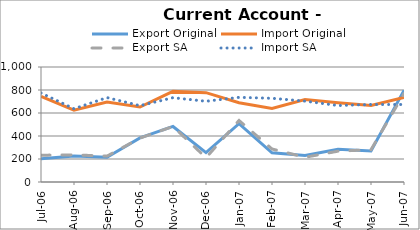
| Category | Export Original | Import Original | Export SA | Import SA |
|---|---|---|---|---|
| 2006-07-31 | 202 | 744 | 233 | 774 |
| 2006-08-31 | 225 | 624 | 236 | 637 |
| 2006-09-30 | 215 | 695 | 225 | 734 |
| 2006-10-31 | 383 | 652 | 382 | 664 |
| 2006-11-30 | 483 | 788 | 483 | 733 |
| 2006-12-31 | 256 | 777 | 211 | 702 |
| 2007-01-31 | 507 | 689 | 535 | 736 |
| 2007-02-28 | 254 | 640 | 287 | 728 |
| 2007-03-31 | 231 | 717 | 215 | 703 |
| 2007-04-30 | 284 | 689 | 268 | 665 |
| 2007-05-31 | 270 | 666 | 281 | 674 |
| 2007-06-30 | 797 | 735 | 769 | 674 |